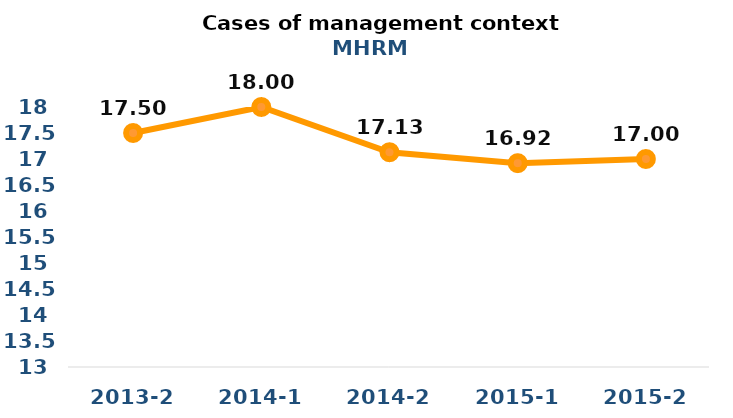
| Category | Series 0 |
|---|---|
| 2013-2 | 17.5 |
| 2014-1 | 18 |
| 2014-2 | 17.13 |
| 2015-1 | 16.92 |
| 2015-2 | 17 |